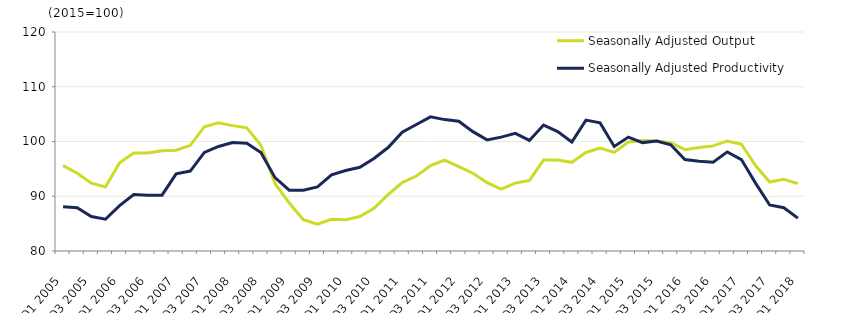
| Category | Seasonally Adjusted Output | Seasonally Adjusted Productivity |
|---|---|---|
| Q1 2005 | 95.6 | 88.1 |
|  | 94.2 | 87.9 |
| Q3 2005 | 92.4 | 86.3 |
|  | 91.7 | 85.8 |
| Q1 2006 | 96.1 | 88.3 |
|  | 97.9 | 90.3 |
| Q3 2006 | 97.9 | 90.2 |
|  | 98.3 | 90.2 |
| Q1 2007 | 98.4 | 94.1 |
|  | 99.3 | 94.6 |
| Q3 2007 | 102.7 | 98 |
|  | 103.4 | 99.1 |
| Q1 2008 | 102.9 | 99.8 |
|  | 102.5 | 99.7 |
| Q3 2008 | 99.3 | 98 |
|  | 92.3 | 93.4 |
| Q1 2009 | 88.8 | 91.1 |
|  | 85.7 | 91.1 |
| Q3 2009 | 84.9 | 91.7 |
|  | 85.8 | 93.9 |
| Q1 2010 | 85.7 | 94.7 |
|  | 86.3 | 95.3 |
| Q3 2010 | 87.8 | 96.9 |
|  | 90.3 | 98.9 |
| Q1 2011 | 92.5 | 101.7 |
|  | 93.7 | 103.1 |
| Q3 2011 | 95.6 | 104.5 |
|  | 96.6 | 104 |
| Q1 2012 | 95.4 | 103.7 |
|  | 94.2 | 101.8 |
| Q3 2012 | 92.5 | 100.3 |
|  | 91.3 | 100.8 |
| Q1 2013 | 92.4 | 101.5 |
|  | 92.9 | 100.2 |
| Q3 2013 | 96.6 | 103 |
|  | 96.6 | 101.8 |
| Q1 2014 | 96.2 | 99.9 |
|  | 98 | 103.9 |
| Q3 2014 | 98.8 | 103.4 |
|  | 98 | 99.1 |
| Q1 2015 | 99.9 | 100.8 |
|  | 100.2 | 99.8 |
| Q3 2015 | 100.1 | 100.1 |
|  | 99.8 | 99.4 |
| Q1 2016 | 98.5 | 96.7 |
|  | 98.9 | 96.4 |
| Q3 2016 | 99.2 | 96.2 |
|  | 100.1 | 98.1 |
| Q1 2017 | 99.5 | 96.7 |
|  | 95.6 | 92.4 |
| Q3 2017 | 92.6 | 88.4 |
|  | 93.1 | 87.9 |
| Q1 2018 | 92.3 | 86 |